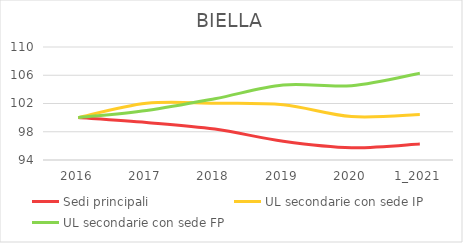
| Category | Sedi principali | UL secondarie con sede IP | UL secondarie con sede FP |
|---|---|---|---|
| 2016 | 100 | 100 | 100 |
| 2017 | 99.319 | 102.036 | 101.017 |
| 2018 | 98.381 | 102.036 | 102.68 |
| 2019 | 96.659 | 101.818 | 104.621 |
| 2020 | 95.741 | 100.145 | 104.529 |
| 1_2021 | 96.278 | 100.436 | 106.285 |